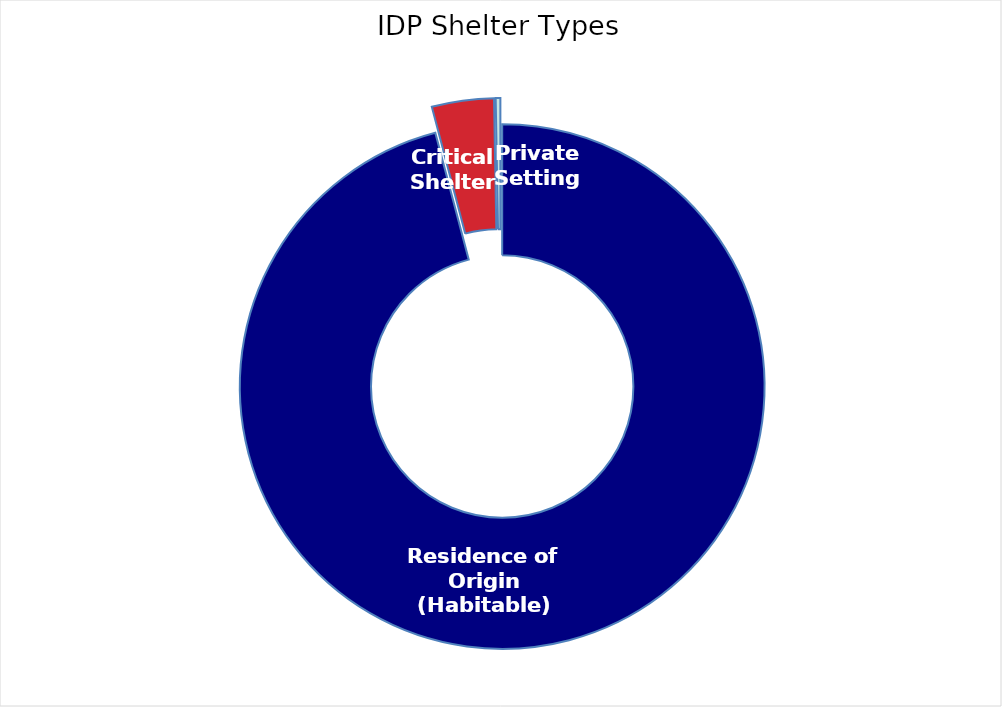
| Category | Individuals |
|---|---|
| Residence of Origin (Habitable) | 4774332 |
| Critical Shelter | 190074 |
| Private Setting | 14214 |